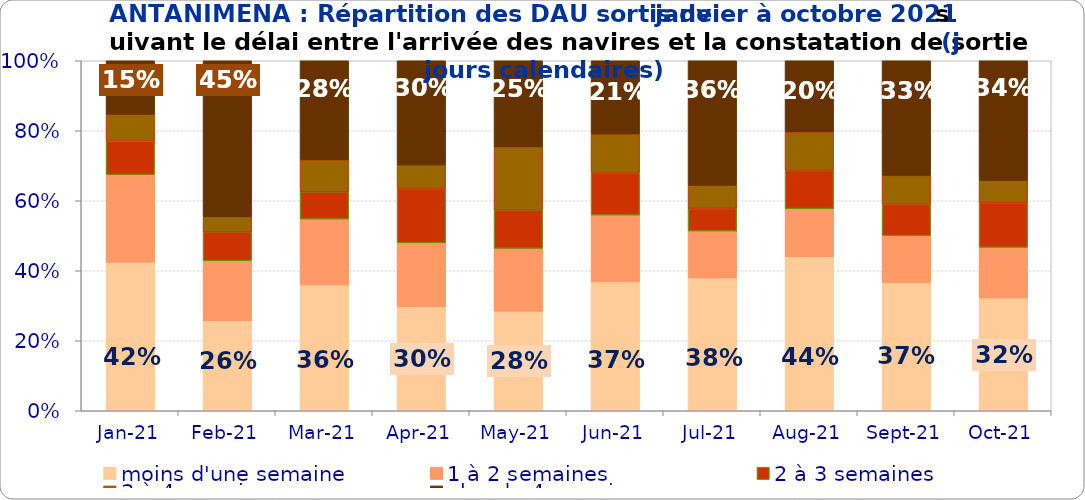
| Category | moins d'une semaine | 1 à 2 semaines | 2 à 3 semaines | 3 à 4 semaines | plus de 4 semaines |
|---|---|---|---|---|---|
| 2021-01-01 | 0.424 | 0.25 | 0.096 | 0.076 | 0.153 |
| 2021-02-01 | 0.257 | 0.171 | 0.081 | 0.044 | 0.446 |
| 2021-03-01 | 0.36 | 0.188 | 0.078 | 0.091 | 0.283 |
| 2021-04-01 | 0.297 | 0.183 | 0.155 | 0.068 | 0.298 |
| 2021-05-01 | 0.284 | 0.18 | 0.109 | 0.181 | 0.246 |
| 2021-06-01 | 0.368 | 0.191 | 0.122 | 0.11 | 0.209 |
| 2021-07-01 | 0.379 | 0.134 | 0.064 | 0.067 | 0.356 |
| 2021-08-01 | 0.44 | 0.137 | 0.109 | 0.11 | 0.203 |
| 2021-09-01 | 0.366 | 0.134 | 0.089 | 0.083 | 0.328 |
| 2021-10-01 | 0.322 | 0.145 | 0.127 | 0.064 | 0.342 |